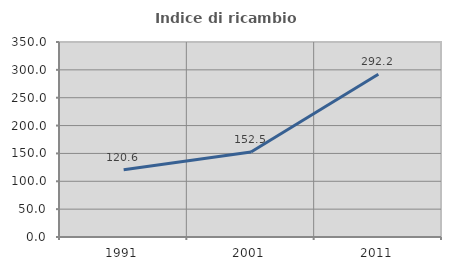
| Category | Indice di ricambio occupazionale  |
|---|---|
| 1991.0 | 120.614 |
| 2001.0 | 152.479 |
| 2011.0 | 292.179 |